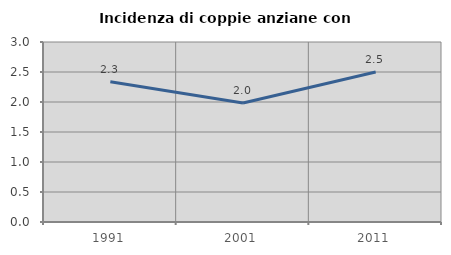
| Category | Incidenza di coppie anziane con figli |
|---|---|
| 1991.0 | 2.339 |
| 2001.0 | 1.984 |
| 2011.0 | 2.5 |